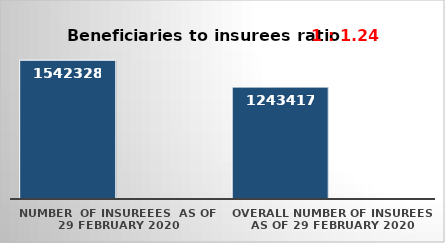
| Category | Series 0 | Series 1 |
|---|---|---|
| NUMBER  of insureees  as of  29 February 2020 | 1542328 |  |
| OVERALL number of insurees as of 29 February 2020 | 1243417 |  |